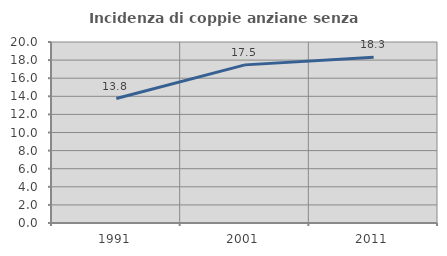
| Category | Incidenza di coppie anziane senza figli  |
|---|---|
| 1991.0 | 13.752 |
| 2001.0 | 17.472 |
| 2011.0 | 18.319 |